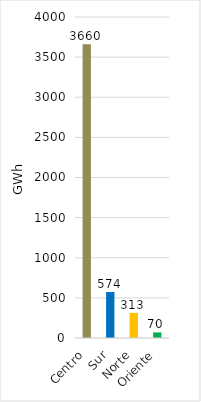
| Category | Series 0 |
|---|---|
| Centro | 3659.583 |
| Sur | 573.529 |
| Norte | 312.928 |
| Oriente | 69.985 |